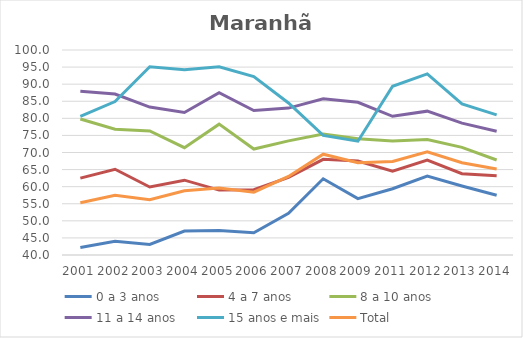
| Category | 0 a 3 anos | 4 a 7 anos | 8 a 10 anos | 11 a 14 anos | 15 anos e mais | Total |
|---|---|---|---|---|---|---|
| 2001.0 | 42.2 | 62.5 | 79.8 | 87.9 | 80.6 | 55.3 |
| 2002.0 | 44 | 65.1 | 76.8 | 87.1 | 84.9 | 57.5 |
| 2003.0 | 43.1 | 59.9 | 76.3 | 83.3 | 95.1 | 56.2 |
| 2004.0 | 47 | 61.9 | 71.4 | 81.7 | 94.2 | 58.8 |
| 2005.0 | 47.2 | 59 | 78.3 | 87.5 | 95.1 | 59.6 |
| 2006.0 | 46.5 | 59.1 | 71 | 82.3 | 92.2 | 58.4 |
| 2007.0 | 52.2 | 62.7 | 73.4 | 83 | 84.5 | 63 |
| 2008.0 | 62.3 | 68 | 75.4 | 85.7 | 75 | 69.5 |
| 2009.0 | 56.5 | 67.5 | 74 | 84.7 | 73.3 | 67 |
| 2011.0 | 59.4 | 64.5 | 73.4 | 80.6 | 89.4 | 67.4 |
| 2012.0 | 63.1 | 67.8 | 73.8 | 82.1 | 93 | 70.2 |
| 2013.0 | 60.2 | 63.8 | 71.5 | 78.6 | 84.2 | 67 |
| 2014.0 | 57.5 | 63.2 | 67.8 | 76.2 | 81 | 65.2 |